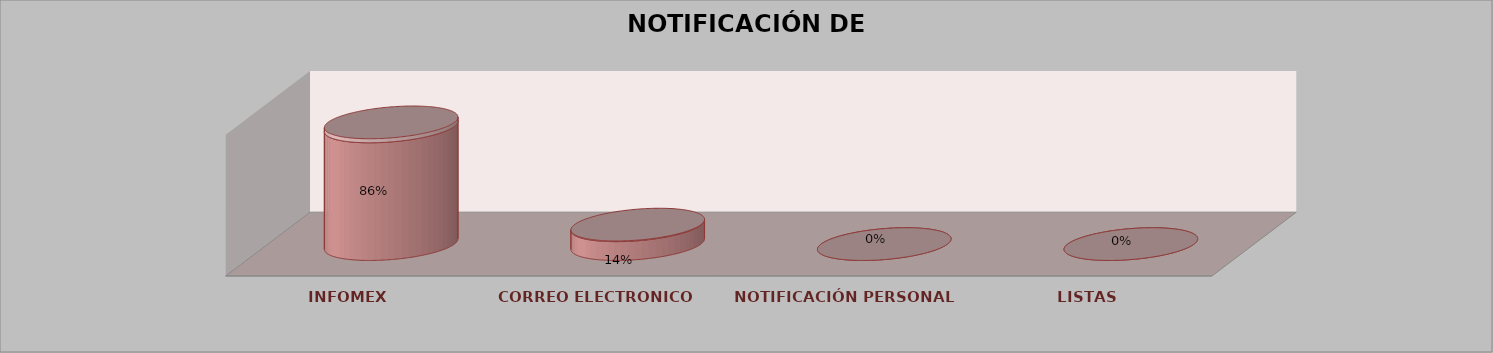
| Category | Series 0 | Series 1 | Series 2 | Series 3 | Series 4 |
|---|---|---|---|---|---|
| INFOMEX |  |  |  | 25 | 0.862 |
| CORREO ELECTRONICO |  |  |  | 4 | 0.138 |
| NOTIFICACIÓN PERSONAL |  |  |  | 0 | 0 |
| LISTAS |  |  |  | 0 | 0 |